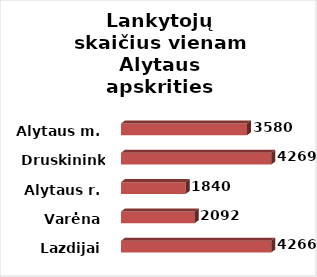
| Category | Series 0 |
|---|---|
| Lazdijai | 4266 |
| Varėna | 2092 |
| Alytaus r. | 1840 |
| Druskininkai | 4269 |
| Alytaus m. | 3580 |